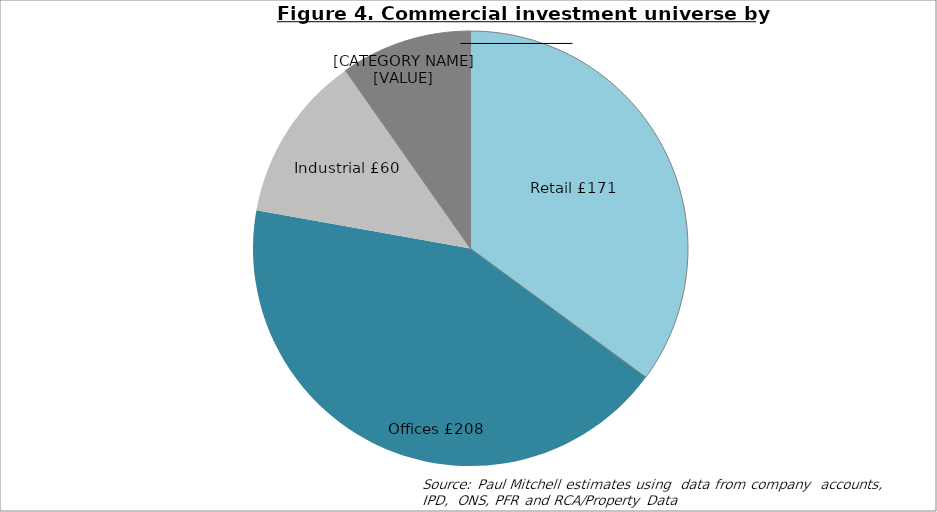
| Category | Series 0 |
|---|---|
| Retail | 170.626 |
| Offices | 207.982 |
| Industrial | 60.488 |
| Other | 47.412 |